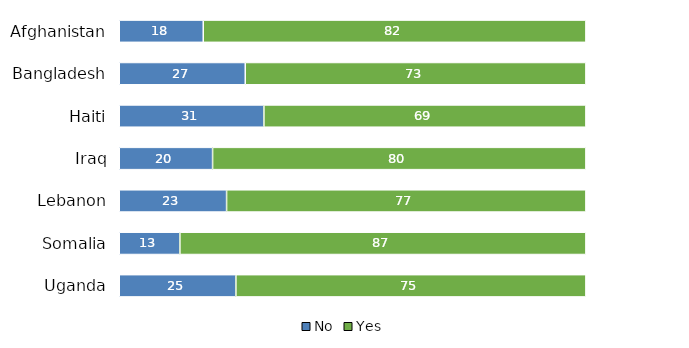
| Category | No | Yes |
|---|---|---|
| Uganda | 25 | 75 |
| Somalia | 13 | 87 |
| Lebanon | 23 | 77 |
| Iraq | 20 | 80 |
| Haiti | 31 | 69 |
| Bangladesh | 27 | 73 |
| Afghanistan | 18 | 82 |